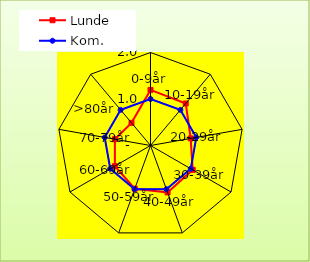
| Category | Lunde | Kom. |
|---|---|---|
| 0-9år | 1.195 | 1 |
| 10-19år | 1.18 | 1 |
| 20-29år | 0.877 | 1 |
| 30-39år | 1.048 | 1 |
| 40-49år | 1.074 | 1 |
| 50-59år | 0.988 | 1 |
| 60-69år | 0.884 | 1 |
| 70-79år | 0.777 | 1 |
| >80år | 0.636 | 1 |